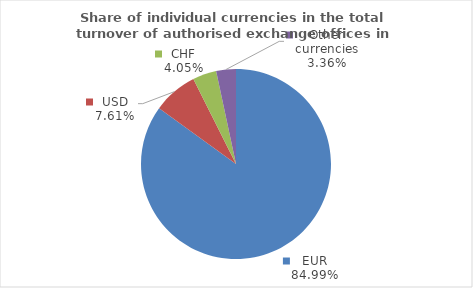
| Category | Series 0 |
|---|---|
| EUR | 84.983 |
| USD | 7.607 |
| CHF | 4.05 |
| Other currencies | 3.36 |